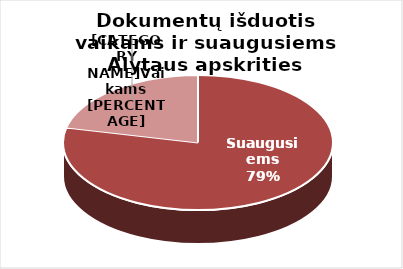
| Category | Series 0 |
|---|---|
| Suaugusiems | 469759 |